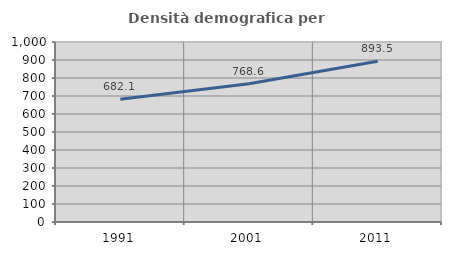
| Category | Densità demografica |
|---|---|
| 1991.0 | 682.104 |
| 2001.0 | 768.568 |
| 2011.0 | 893.46 |